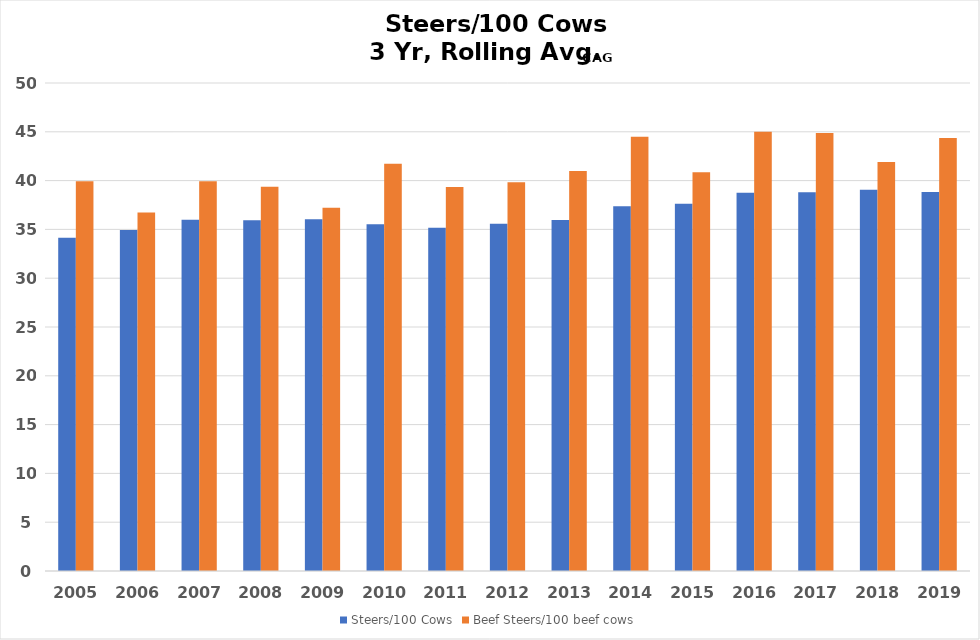
| Category | Steers/100 Cows | Beef Steers/100 beef cows |
|---|---|---|
| 2005.0 | 34.134 | 39.941 |
| 2006.0 | 34.942 | 36.719 |
| 2007.0 | 35.979 | 39.928 |
| 2008.0 | 35.929 | 39.363 |
| 2009.0 | 36.051 | 37.222 |
| 2010.0 | 35.523 | 41.723 |
| 2011.0 | 35.16 | 39.347 |
| 2012.0 | 35.586 | 39.842 |
| 2013.0 | 35.958 | 40.993 |
| 2014.0 | 37.377 | 44.481 |
| 2015.0 | 37.638 | 40.867 |
| 2016.0 | 38.763 | 44.994 |
| 2017.0 | 38.802 | 44.866 |
| 2018.0 | 39.06 | 41.895 |
| 2019.0 | 38.83 | 44.354 |